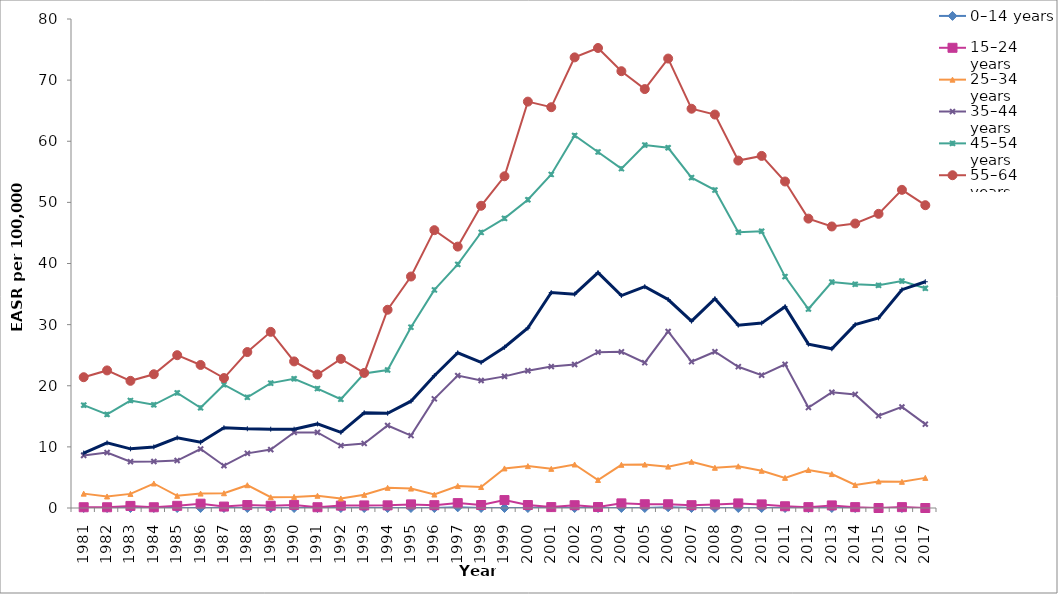
| Category | 0–14 years | 15–24 years | 25–34 years | 35–44 years | 45–54 years | 55–64 years | 65+ years |
|---|---|---|---|---|---|---|---|
| 1981.0 | 0 | 0.124 | 2.351 | 8.593 | 16.821 | 21.397 | 8.993 |
| 1982.0 | 0 | 0.121 | 1.888 | 9.071 | 15.31 | 22.508 | 10.661 |
| 1983.0 | 0 | 0.342 | 2.308 | 7.58 | 17.58 | 20.804 | 9.679 |
| 1984.0 | 0 | 0.121 | 4.01 | 7.611 | 16.88 | 21.882 | 9.99 |
| 1985.0 | 0 | 0.356 | 1.99 | 7.764 | 18.832 | 25 | 11.49 |
| 1986.0 | 0 | 0.704 | 2.357 | 9.649 | 16.396 | 23.401 | 10.757 |
| 1987.0 | 0 | 0.233 | 2.412 | 6.922 | 20.172 | 21.26 | 13.133 |
| 1988.0 | 0 | 0.483 | 3.731 | 8.943 | 18.116 | 25.514 | 12.965 |
| 1989.0 | 0 | 0.372 | 1.76 | 9.556 | 20.428 | 28.816 | 12.895 |
| 1990.0 | 0 | 0.504 | 1.815 | 12.365 | 21.141 | 23.982 | 12.892 |
| 1991.0 | 0 | 0.127 | 2.001 | 12.371 | 19.537 | 21.842 | 13.753 |
| 1992.0 | 0 | 0.392 | 1.561 | 10.212 | 17.797 | 24.397 | 12.379 |
| 1993.0 | 0 | 0.424 | 2.159 | 10.557 | 22.007 | 22.097 | 15.579 |
| 1994.0 | 0 | 0.434 | 3.301 | 13.503 | 22.582 | 32.431 | 15.502 |
| 1995.0 | 0 | 0.592 | 3.179 | 11.852 | 29.586 | 37.869 | 17.477 |
| 1996.0 | 0 | 0.46 | 2.202 | 17.851 | 35.675 | 45.454 | 21.644 |
| 1997.0 | 0.105 | 0.802 | 3.607 | 21.663 | 39.855 | 42.764 | 25.396 |
| 1998.0 | 0 | 0.488 | 3.432 | 20.86 | 45.085 | 49.445 | 23.822 |
| 1999.0 | 0 | 1.297 | 6.475 | 21.536 | 47.38 | 54.269 | 26.304 |
| 2000.0 | 0 | 0.488 | 6.851 | 22.454 | 50.433 | 66.484 | 29.443 |
| 2001.0 | 0.109 | 0.148 | 6.405 | 23.146 | 54.564 | 65.569 | 35.248 |
| 2002.0 | 0 | 0.457 | 7.118 | 23.473 | 60.94 | 73.722 | 34.989 |
| 2003.0 | 0 | 0.159 | 4.586 | 25.489 | 58.246 | 75.257 | 38.507 |
| 2004.0 | 0 | 0.759 | 7.066 | 25.544 | 55.52 | 71.462 | 34.756 |
| 2005.0 | 0 | 0.617 | 7.113 | 23.772 | 59.373 | 68.537 | 36.209 |
| 2006.0 | 0.113 | 0.613 | 6.769 | 28.875 | 58.934 | 73.528 | 34.106 |
| 2007.0 | 0 | 0.46 | 7.565 | 23.932 | 54.051 | 65.317 | 30.577 |
| 2008.0 | 0 | 0.59 | 6.581 | 25.567 | 52.022 | 64.37 | 34.239 |
| 2009.0 | 0 | 0.751 | 6.822 | 23.113 | 45.115 | 56.841 | 29.911 |
| 2010.0 | 0 | 0.589 | 6.091 | 21.722 | 45.276 | 57.602 | 30.248 |
| 2011.0 | 0 | 0.284 | 4.934 | 23.501 | 37.859 | 53.418 | 32.939 |
| 2012.0 | 0 | 0.141 | 6.22 | 16.442 | 32.554 | 47.341 | 26.81 |
| 2013.0 | 0 | 0.423 | 5.552 | 18.929 | 36.961 | 46.058 | 26.047 |
| 2014.0 | 0 | 0.141 | 3.761 | 18.585 | 36.604 | 46.538 | 30.006 |
| 2015.0 | 0 | 0 | 4.347 | 15.09 | 36.432 | 48.124 | 31.097 |
| 2016.0 | 0 | 0.143 | 4.285 | 16.534 | 37.129 | 52.05 | 35.715 |
| 2017.0 | 0 | 0 | 4.927 | 13.718 | 35.946 | 49.537 | 37.013 |